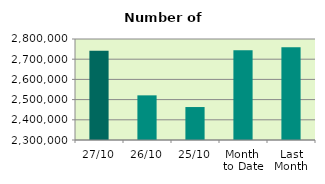
| Category | Series 0 |
|---|---|
| 27/10 | 2741462 |
| 26/10 | 2521042 |
| 25/10 | 2463192 |
| Month 
to Date | 2744645.684 |
| Last
Month | 2759252.364 |